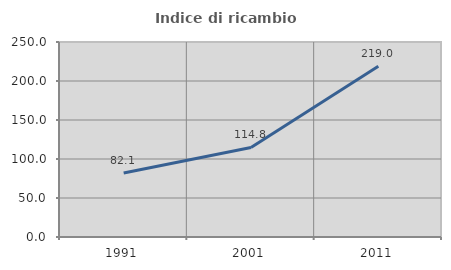
| Category | Indice di ricambio occupazionale  |
|---|---|
| 1991.0 | 82.051 |
| 2001.0 | 114.815 |
| 2011.0 | 219.048 |